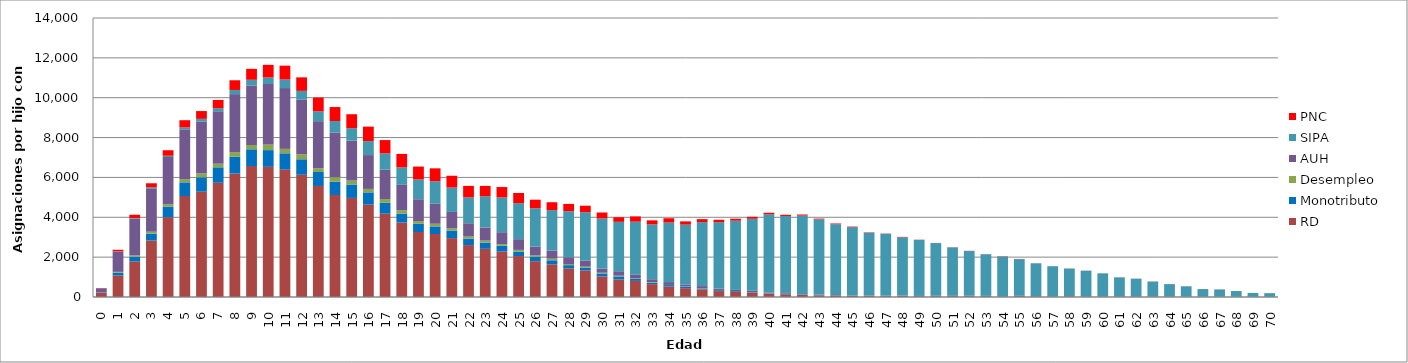
| Category | RD | Monotributo | Desempleo | AUH | SIPA | PNC |
|---|---|---|---|---|---|---|
| 0.0 | 209 | 27 | 8 | 190 | 2 | 14 |
| 1.0 | 1078 | 144 | 39 | 1017 | 13 | 80 |
| 2.0 | 1777 | 240 | 70 | 1842 | 29 | 170 |
| 3.0 | 2834 | 346 | 96 | 2181 | 51 | 199 |
| 4.0 | 4005 | 521 | 127 | 2373 | 61 | 277 |
| 5.0 | 5065 | 689 | 162 | 2498 | 95 | 362 |
| 6.0 | 5283 | 720 | 198 | 2595 | 143 | 391 |
| 7.0 | 5731 | 777 | 182 | 2630 | 156 | 412 |
| 8.0 | 6190 | 851 | 230 | 2909 | 209 | 486 |
| 9.0 | 6568 | 845 | 214 | 2986 | 287 | 548 |
| 10.0 | 6531 | 840 | 276 | 3042 | 327 | 634 |
| 11.0 | 6394 | 817 | 222 | 3052 | 428 | 696 |
| 12.0 | 6134 | 777 | 250 | 2737 | 446 | 677 |
| 13.0 | 5572 | 700 | 186 | 2365 | 489 | 697 |
| 14.0 | 5119 | 669 | 225 | 2239 | 578 | 702 |
| 15.0 | 4971 | 674 | 197 | 2005 | 624 | 700 |
| 16.0 | 4631 | 619 | 174 | 1698 | 699 | 728 |
| 17.0 | 4181 | 545 | 190 | 1473 | 817 | 669 |
| 18.0 | 3738 | 444 | 168 | 1279 | 873 | 678 |
| 19.0 | 3263 | 407 | 141 | 1095 | 993 | 646 |
| 20.0 | 3161 | 381 | 135 | 1002 | 1126 | 651 |
| 21.0 | 2955 | 378 | 119 | 817 | 1223 | 592 |
| 22.0 | 2604 | 324 | 106 | 667 | 1296 | 578 |
| 23.0 | 2418 | 310 | 104 | 648 | 1571 | 524 |
| 24.0 | 2281 | 292 | 82 | 596 | 1746 | 521 |
| 25.0 | 2055 | 221 | 88 | 538 | 1807 | 511 |
| 26.0 | 1797 | 214 | 75 | 441 | 1927 | 429 |
| 27.0 | 1640 | 203 | 79 | 403 | 2035 | 395 |
| 28.0 | 1428 | 170 | 56 | 341 | 2310 | 366 |
| 29.0 | 1331 | 146 | 45 | 301 | 2429 | 329 |
| 30.0 | 1031 | 149 | 38 | 205 | 2517 | 301 |
| 31.0 | 879 | 155 | 36 | 224 | 2478 | 231 |
| 32.0 | 808 | 99 | 27 | 181 | 2664 | 264 |
| 33.0 | 646 | 75 | 32 | 139 | 2752 | 202 |
| 34.0 | 519 | 79 | 7 | 143 | 2989 | 215 |
| 35.0 | 443 | 68 | 14 | 108 | 2999 | 163 |
| 36.0 | 381 | 50 | 14 | 102 | 3211 | 149 |
| 37.0 | 297 | 48 | 9 | 70 | 3331 | 122 |
| 38.0 | 251 | 41 | 4 | 60 | 3473 | 100 |
| 39.0 | 211 | 30 | 9 | 62 | 3614 | 99 |
| 40.0 | 159 | 21 | 2 | 33 | 3935 | 77 |
| 41.0 | 132 | 29 | 3 | 39 | 3863 | 60 |
| 42.0 | 100 | 15 | 2 | 25 | 3945 | 52 |
| 43.0 | 80 | 16 | 1 | 27 | 3775 | 36 |
| 44.0 | 74 | 11 | 0 | 15 | 3555 | 34 |
| 45.0 | 52 | 11 | 0 | 7 | 3437 | 26 |
| 46.0 | 44 | 11 | 3 | 9 | 3161 | 18 |
| 47.0 | 39 | 15 | 2 | 9 | 3107 | 12 |
| 48.0 | 46 | 15 | 2 | 14 | 2922 | 18 |
| 49.0 | 32 | 13 | 1 | 7 | 2814 | 10 |
| 50.0 | 34 | 15 | 1 | 10 | 2646 | 7 |
| 51.0 | 33 | 17 | 1 | 8 | 2430 | 9 |
| 52.0 | 39 | 10 | 2 | 13 | 2241 | 12 |
| 53.0 | 38 | 14 | 0 | 5 | 2088 | 5 |
| 54.0 | 17 | 12 | 0 | 5 | 1997 | 12 |
| 55.0 | 35 | 18 | 0 | 6 | 1842 | 9 |
| 56.0 | 26 | 14 | 0 | 4 | 1646 | 5 |
| 57.0 | 20 | 11 | 0 | 0 | 1515 | 1 |
| 58.0 | 33 | 4 | 1 | 2 | 1386 | 6 |
| 59.0 | 17 | 16 | 0 | 2 | 1284 | 5 |
| 60.0 | 13 | 8 | 0 | 3 | 1163 | 2 |
| 61.0 | 21 | 13 | 0 | 4 | 948 | 2 |
| 62.0 | 24 | 7 | 0 | 7 | 880 | 3 |
| 63.0 | 11 | 8 | 0 | 1 | 753 | 7 |
| 64.0 | 18 | 8 | 1 | 1 | 618 | 2 |
| 65.0 | 10 | 3 | 0 | 3 | 520 | 3 |
| 66.0 | 8 | 3 | 0 | 1 | 385 | 3 |
| 67.0 | 10 | 2 | 0 | 0 | 364 | 6 |
| 68.0 | 8 | 2 | 0 | 0 | 288 | 3 |
| 69.0 | 3 | 1 | 0 | 0 | 200 | 1 |
| 70.0 | 2 | 0 | 0 | 1 | 189 | 2 |